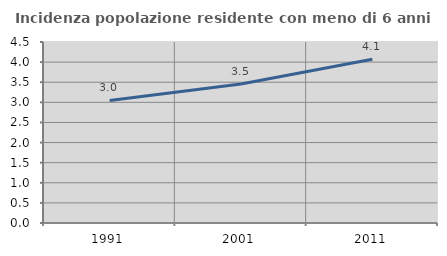
| Category | Incidenza popolazione residente con meno di 6 anni |
|---|---|
| 1991.0 | 3.048 |
| 2001.0 | 3.457 |
| 2011.0 | 4.073 |